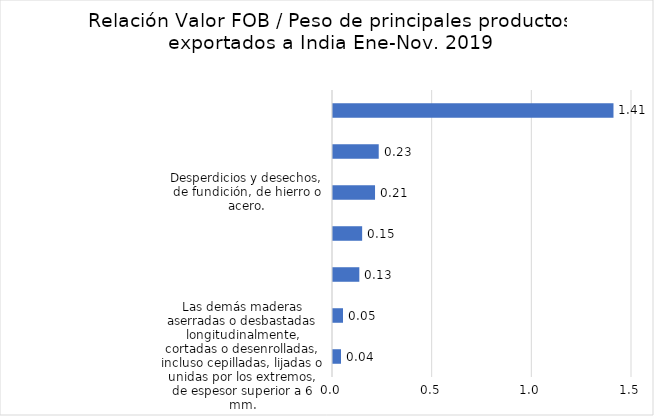
| Category | Series 0 |
|---|---|
| Las demás maderas aserradas o desbastadas longitudinalmente, cortadas o desenrolladas, incluso cepilladas, lijadas o unidas por los extremos, de espesor superior a 6 mm. | 0.04 |
| Los demás papeles o cartones, incluidos los desperdicios y desechos sin clasificar. | 0.05 |
| Las demás maderas en bruto, incluso descortezadas, desalburadas o escuadradas. | 0.132 |
| Las demás maderas, incluso descortezadas, desalburadas o escuadradas de las maderas tropicales citadas en la nota de subpartida 2 de este Capítulo. | 0.146 |
| Desperdicios y desechos, de fundición, de hierro o acero. | 0.211 |
| Desperdicios y desechos, de aluminio. | 0.229 |
| Cueros y pieles curtidos o "crust" de bovino, enteros, depilados, de semicurtición mineral al cromo húmedo ("Wet blue"), con una superficie por unidad inferior o unidad inferior o igual a 2.6 m2 (28 pies cuadrados), excepto en plena flor sin dividir; divid | 1.407 |